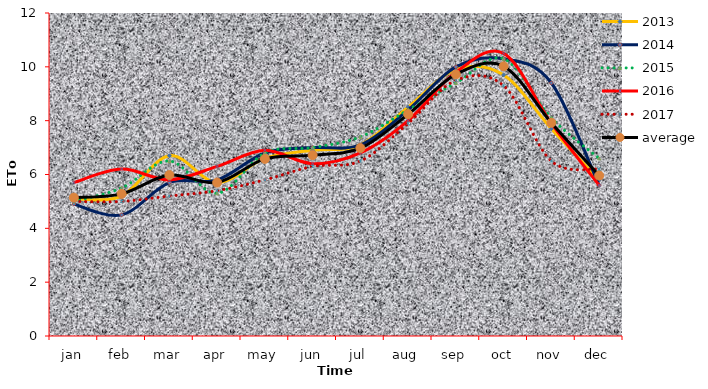
| Category | 2013 | 2014 | 2015 | 2016 | 2017 | average |
|---|---|---|---|---|---|---|
| jan | 5.1 | 4.9 | 5 | 5.7 | 5 | 5.14 |
| feb | 5.2 | 4.5 | 5.5 | 6.2 | 5 | 5.28 |
| mar | 6.7 | 5.7 | 6.5 | 5.8 | 5.2 | 5.98 |
| apr | 5.7 | 5.8 | 5.3 | 6.3 | 5.4 | 5.7 |
| may | 6.6 | 6.8 | 6.8 | 6.9 | 5.8 | 6.58 |
| jun | 6.9 | 7 | 7 | 6.4 | 6.3 | 6.72 |
| jul | 7.1 | 7.1 | 7.4 | 6.8 | 6.5 | 6.98 |
| aug | 8.5 | 8.4 | 8.4 | 8 | 7.9 | 8.24 |
| sep | 9.9 | 10 | 9.4 | 9.8 | 9.5 | 9.72 |
| oct | 9.7 | 10.3 | 10.3 | 10.5 | 9.3 | 10.02 |
| nov | 7.7 | 9.4 | 8.1 | 7.9 | 6.5 | 7.92 |
| dec | 5.8 | 5.6 | 6.6 | 5.6 | 6.2 | 5.96 |